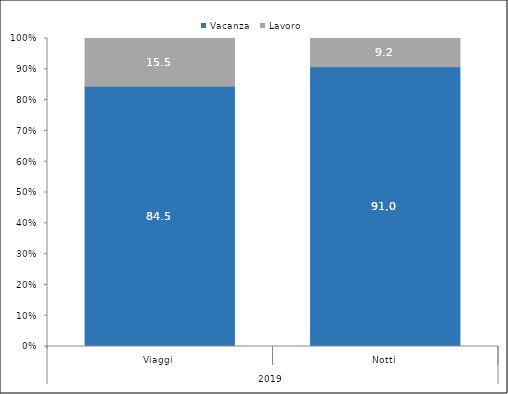
| Category | Vacanza | Lavoro |
|---|---|---|
| 0 | 84.5 | 15.5 |
| 1 | 90.8 | 9.2 |